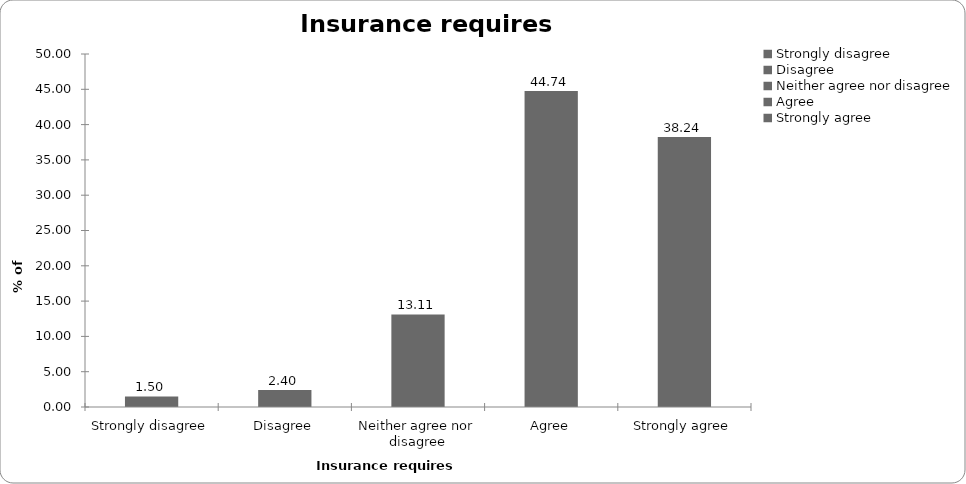
| Category | Insurance requires regulation |
|---|---|
| Strongly disagree | 1.502 |
| Disagree | 2.402 |
| Neither agree nor disagree | 13.113 |
| Agree | 44.745 |
| Strongly agree | 38.238 |